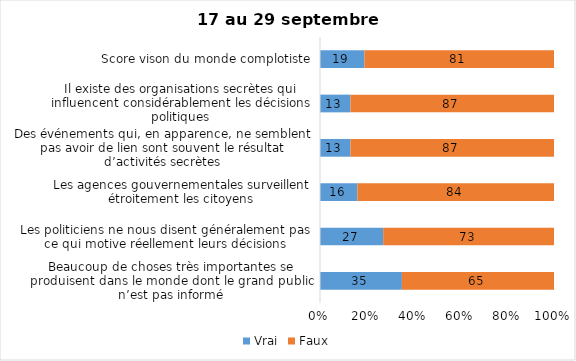
| Category | Vrai | Faux |
|---|---|---|
| Beaucoup de choses très importantes se produisent dans le monde dont le grand public n’est pas informé | 35 | 65 |
| Les politiciens ne nous disent généralement pas ce qui motive réellement leurs décisions | 27 | 73 |
| Les agences gouvernementales surveillent étroitement les citoyens | 16 | 84 |
| Des événements qui, en apparence, ne semblent pas avoir de lien sont souvent le résultat d’activités secrètes | 13 | 87 |
| Il existe des organisations secrètes qui influencent considérablement les décisions politiques | 13 | 87 |
| Score vison du monde complotiste | 19 | 81 |